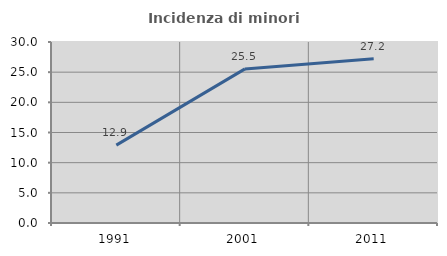
| Category | Incidenza di minori stranieri |
|---|---|
| 1991.0 | 12.903 |
| 2001.0 | 25.54 |
| 2011.0 | 27.224 |